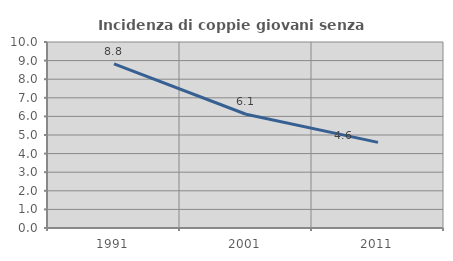
| Category | Incidenza di coppie giovani senza figli |
|---|---|
| 1991.0 | 8.829 |
| 2001.0 | 6.115 |
| 2011.0 | 4.602 |